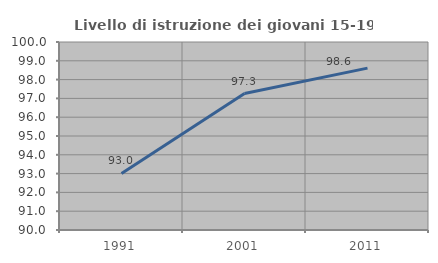
| Category | Livello di istruzione dei giovani 15-19 anni |
|---|---|
| 1991.0 | 93.008 |
| 2001.0 | 97.258 |
| 2011.0 | 98.611 |